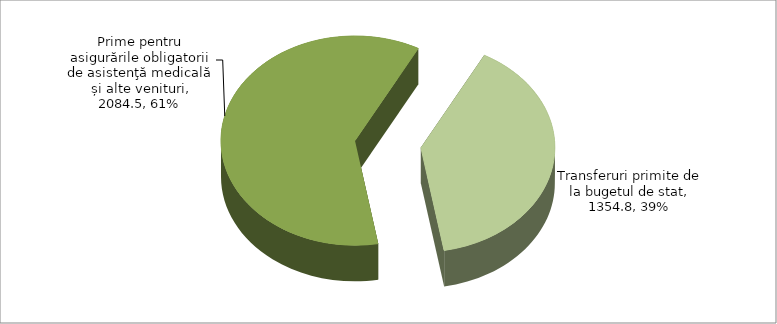
| Category | Series 0 |
|---|---|
| Prime pentru asigurările obligatorii de asistenţă medicală și alte venituri | 2084.5 |
| Transferuri primite de la bugetul de stat | 1354.8 |